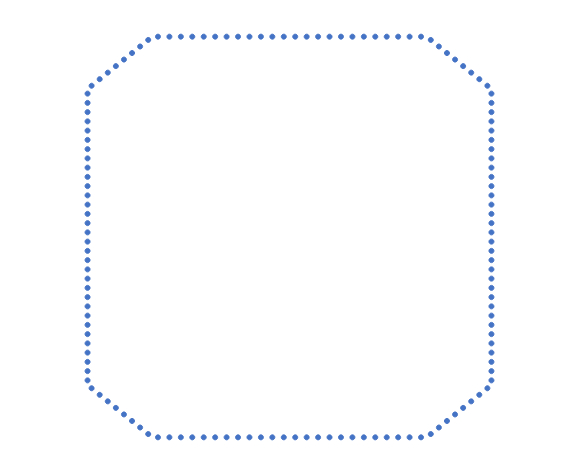
| Category | Series 0 |
|---|---|
| 2.207 | 1.938 |
| 2.207 | 1.812 |
| 2.207 | 1.688 |
| 2.207 | 1.562 |
| 2.207 | 1.438 |
| 2.207 | 1.312 |
| 2.207 | 1.188 |
| 2.207 | 1.062 |
| 2.207 | 0.938 |
| 2.207 | 0.812 |
| 2.207 | 0.688 |
| 2.207 | 0.562 |
| 2.207 | 0.438 |
| 2.207 | 0.312 |
| 2.207 | 0.188 |
| 2.207 | 0.062 |
| 2.207 | -0.062 |
| 2.207 | -0.188 |
| 2.207 | -0.312 |
| 2.207 | -0.438 |
| 2.207 | -0.562 |
| 2.207 | -0.688 |
| 2.207 | -0.812 |
| 2.207 | -0.938 |
| 2.207 | -1.062 |
| 2.207 | -1.188 |
| 2.207 | -1.312 |
| 2.207 | -1.438 |
| 2.207 | -1.562 |
| 2.207 | -1.688 |
| 2.207 | -1.812 |
| 2.207 | -1.938 |
| 2.1628058261758407 | -2.044 |
| 2.0744174785275225 | -2.133 |
| 1.986029130879204 | -2.221 |
| 1.8976407832308855 | -2.309 |
| 1.809252435582567 | -2.398 |
| 1.7208640879342485 | -2.486 |
| 1.63247574028593 | -2.575 |
| 1.5440873926376115 | -2.663 |
| 1.4375 | -2.707 |
| 1.3125 | -2.707 |
| 1.1875 | -2.707 |
| 1.0625 | -2.707 |
| 0.9375 | -2.707 |
| 0.8125 | -2.707 |
| 0.6875 | -2.707 |
| 0.5625 | -2.707 |
| 0.4375 | -2.707 |
| 0.3125 | -2.707 |
| 0.1875 | -2.707 |
| 0.0625 | -2.707 |
| -0.0625 | -2.707 |
| -0.1875 | -2.707 |
| -0.3125 | -2.707 |
| -0.4375 | -2.707 |
| -0.5625 | -2.707 |
| -0.6875 | -2.707 |
| -0.8125 | -2.707 |
| -0.9375 | -2.707 |
| -1.0625 | -2.707 |
| -1.1875 | -2.707 |
| -1.3125 | -2.707 |
| -1.4375 | -2.707 |
| -1.5441941738241591 | -2.663 |
| -1.6325825214724776 | -2.574 |
| -1.720970869120796 | -2.486 |
| -1.8093592167691146 | -2.398 |
| -1.897747564417433 | -2.309 |
| -1.9861359120657516 | -2.221 |
| -2.07452425971407 | -2.132 |
| -2.1629126073623883 | -2.044 |
| -2.207 | -1.938 |
| -2.207 | -1.812 |
| -2.207 | -1.688 |
| -2.207 | -1.562 |
| -2.207 | -1.438 |
| -2.207 | -1.312 |
| -2.207 | -1.188 |
| -2.207 | -1.062 |
| -2.207 | -0.938 |
| -2.207 | -0.812 |
| -2.207 | -0.688 |
| -2.207 | -0.562 |
| -2.207 | -0.438 |
| -2.207 | -0.312 |
| -2.207 | -0.188 |
| -2.207 | -0.062 |
| -2.207 | 0.062 |
| -2.207 | 0.188 |
| -2.207 | 0.312 |
| -2.207 | 0.438 |
| -2.207 | 0.562 |
| -2.207 | 0.688 |
| -2.207 | 0.812 |
| -2.207 | 0.938 |
| -2.207 | 1.062 |
| -2.207 | 1.188 |
| -2.207 | 1.312 |
| -2.207 | 1.438 |
| -2.207 | 1.562 |
| -2.207 | 1.688 |
| -2.207 | 1.812 |
| -2.207 | 1.938 |
| -2.1628058261758407 | 2.044 |
| -2.0744174785275225 | 2.133 |
| -1.986029130879204 | 2.221 |
| -1.8976407832308855 | 2.309 |
| -1.809252435582567 | 2.398 |
| -1.7208640879342485 | 2.486 |
| -1.63247574028593 | 2.575 |
| -1.5440873926376115 | 2.663 |
| -1.4375 | 2.707 |
| -1.3125 | 2.707 |
| -1.1875 | 2.707 |
| -1.0625 | 2.707 |
| -0.9375 | 2.707 |
| -0.8125 | 2.707 |
| -0.6875 | 2.707 |
| -0.5625 | 2.707 |
| -0.4375 | 2.707 |
| -0.3125 | 2.707 |
| -0.1875 | 2.707 |
| -0.0625 | 2.707 |
| 0.0625 | 2.707 |
| 0.1875 | 2.707 |
| 0.3125 | 2.707 |
| 0.4375 | 2.707 |
| 0.5625 | 2.707 |
| 0.6875 | 2.707 |
| 0.8125 | 2.707 |
| 0.9375 | 2.707 |
| 1.0625 | 2.707 |
| 1.1875 | 2.707 |
| 1.3125 | 2.707 |
| 1.4375 | 2.707 |
| 1.5441941738241591 | 2.663 |
| 1.6325825214724776 | 2.574 |
| 1.720970869120796 | 2.486 |
| 1.8093592167691146 | 2.398 |
| 1.897747564417433 | 2.309 |
| 1.9861359120657516 | 2.221 |
| 2.07452425971407 | 2.132 |
| 2.1629126073623883 | 2.044 |